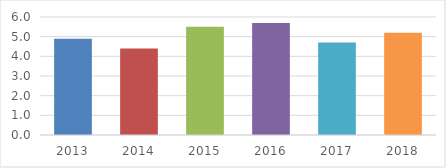
| Category | ALUMNOS BECADOS (%) |
|---|---|
| 2013.0 | 4.9 |
| 2014.0 | 4.4 |
| 2015.0 | 5.5 |
| 2016.0 | 5.7 |
| 2017.0 | 4.7 |
| 2018.0 | 5.2 |